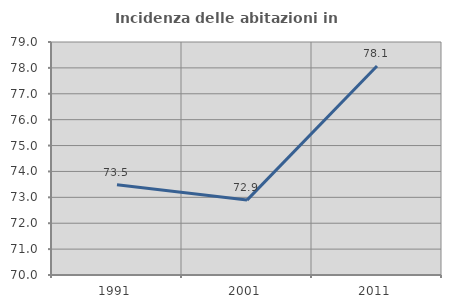
| Category | Incidenza delle abitazioni in proprietà  |
|---|---|
| 1991.0 | 73.482 |
| 2001.0 | 72.893 |
| 2011.0 | 78.076 |